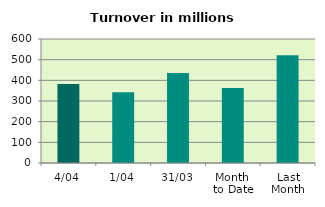
| Category | Series 0 |
|---|---|
| 4/04 | 382.805 |
| 1/04 | 341.937 |
| 31/03 | 435.876 |
| Month 
to Date | 362.371 |
| Last
Month | 521.26 |